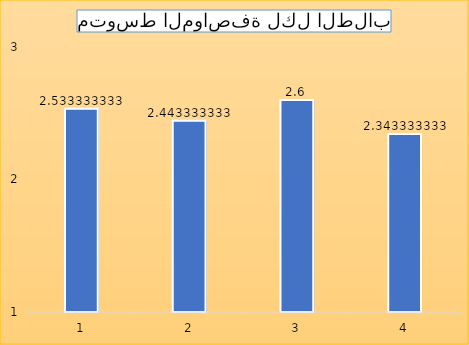
| Category | Series 0 |
|---|---|
| 0 | 2.533 |
| 1 | 2.443 |
| 2 | 2.6 |
| 3 | 2.343 |